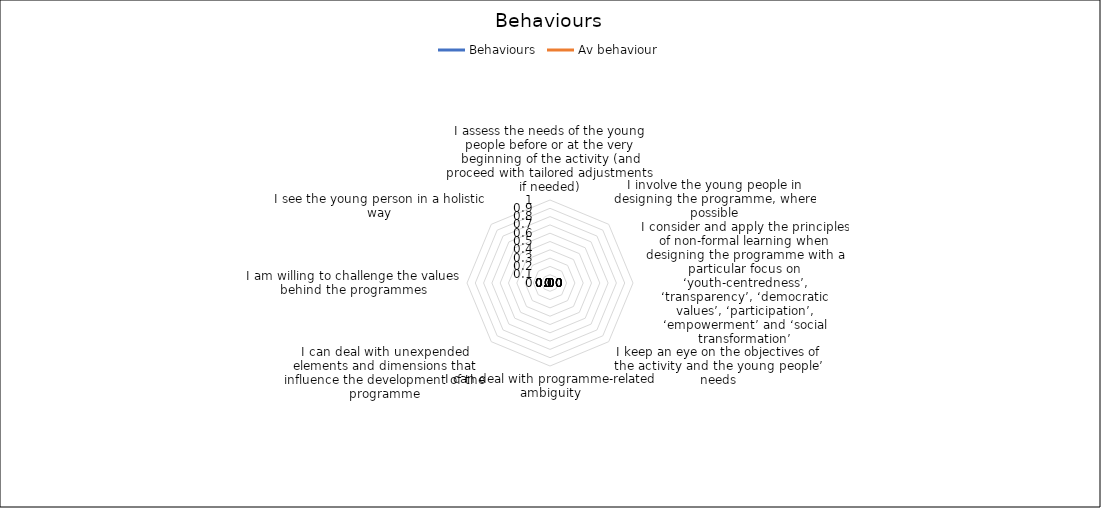
| Category | Behaviours | Av behaviour |
|---|---|---|
| I assess the needs of the young people before or at the very beginning of the activity (and proceed with tailored adjustments if needed) | 0 | 0 |
| I involve the young people in designing the programme, where possible | 0 | 0 |
| I consider and apply the principles of non-formal learning when designing the programme with a particular focus on ‘youth-centredness’, ‘transparency’, ‘democratic values’, ‘participation’, ‘empowerment’ and ‘social transformation’ | 0 | 0 |
| I keep an eye on the objectives of the activity and the young people’ needs | 0 | 0 |
| I can deal with programme-related ambiguity | 0 | 0 |
| I can deal with unexpended elements and dimensions that influence the development of the programme | 0 | 0 |
| I am willing to challenge the values behind the programmes | 0 | 0 |
| I see the young person in a holistic way | 0 | 0 |